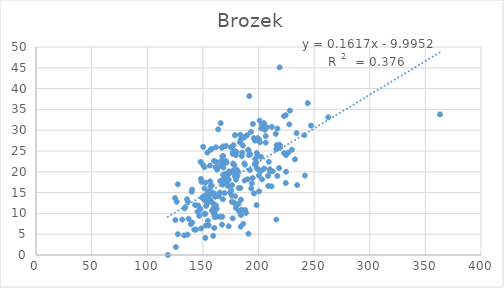
| Category | Brozek |
|---|---|
| 154.25 | 12.6 |
| 173.25 | 6.9 |
| 154.0 | 24.6 |
| 184.75 | 10.9 |
| 184.25 | 27.8 |
| 210.25 | 20.6 |
| 181.0 | 19 |
| 176.0 | 12.8 |
| 191.0 | 5.1 |
| 198.25 | 12 |
| 186.25 | 7.5 |
| 216.0 | 8.5 |
| 180.5 | 20.5 |
| 205.25 | 20.8 |
| 187.75 | 21.7 |
| 162.75 | 20.5 |
| 195.75 | 28.1 |
| 209.25 | 22.4 |
| 183.75 | 16.1 |
| 211.75 | 16.5 |
| 179.0 | 19 |
| 200.5 | 15.3 |
| 140.25 | 15.7 |
| 148.75 | 17.6 |
| 151.25 | 14.2 |
| 159.25 | 4.6 |
| 131.5 | 8.5 |
| 148.0 | 22.4 |
| 133.25 | 4.7 |
| 160.75 | 9.4 |
| 182.0 | 12.3 |
| 160.25 | 6.5 |
| 168.0 | 13.4 |
| 218.5 | 20.9 |
| 247.25 | 31.1 |
| 191.75 | 38.2 |
| 202.25 | 23.6 |
| 196.75 | 27.5 |
| 363.15 | 33.8 |
| 203.0 | 31.3 |
| 262.75 | 33.1 |
| 205.0 | 31.7 |
| 217.0 | 30.4 |
| 212.0 | 30.8 |
| 125.25 | 8.4 |
| 164.25 | 14.1 |
| 133.5 | 11.2 |
| 148.5 | 6.4 |
| 135.75 | 13.4 |
| 127.5 | 5 |
| 158.25 | 10.7 |
| 139.25 | 7.4 |
| 137.25 | 8.7 |
| 152.75 | 7.1 |
| 136.25 | 4.9 |
| 198.0 | 22.2 |
| 181.5 | 20.1 |
| 201.25 | 27.1 |
| 202.5 | 30.4 |
| 179.75 | 24 |
| 216.0 | 25.4 |
| 178.75 | 28.8 |
| 193.25 | 29.6 |
| 178.0 | 25.1 |
| 205.5 | 31 |
| 183.5 | 28.9 |
| 151.5 | 21.1 |
| 154.75 | 14 |
| 155.25 | 7.1 |
| 156.75 | 13.2 |
| 167.5 | 23.7 |
| 146.75 | 9.4 |
| 160.75 | 9.1 |
| 125.0 | 13.7 |
| 143.0 | 12 |
| 148.25 | 18.3 |
| 162.5 | 9.2 |
| 177.75 | 21.7 |
| 161.25 | 21.1 |
| 171.25 | 18.6 |
| 163.75 | 30.2 |
| 150.25 | 26 |
| 190.25 | 18.2 |
| 170.75 | 26.2 |
| 168.0 | 26.1 |
| 167.0 | 25.8 |
| 157.75 | 15 |
| 160.0 | 22.6 |
| 176.75 | 8.8 |
| 176.0 | 14.3 |
| 177.0 | 20.2 |
| 179.75 | 18.1 |
| 165.25 | 9.2 |
| 192.5 | 24.2 |
| 184.25 | 9.6 |
| 224.5 | 17.3 |
| 188.75 | 10.1 |
| 162.5 | 11.1 |
| 156.5 | 17.7 |
| 197.0 | 21.7 |
| 198.5 | 20.8 |
| 173.75 | 20.1 |
| 172.75 | 19.8 |
| 196.75 | 21.9 |
| 177.0 | 24.7 |
| 165.5 | 17.8 |
| 200.25 | 19.1 |
| 203.25 | 18.2 |
| 194.0 | 17.2 |
| 168.5 | 21 |
| 170.75 | 19.5 |
| 183.25 | 27.1 |
| 178.25 | 21.6 |
| 163.0 | 20.9 |
| 175.25 | 25.9 |
| 158.0 | 16.7 |
| 177.25 | 19.8 |
| 179.0 | 14.1 |
| 191.0 | 25.1 |
| 187.5 | 17.9 |
| 206.5 | 27 |
| 185.25 | 24.6 |
| 160.25 | 14.8 |
| 151.5 | 16 |
| 161.0 | 14 |
| 167.0 | 17.4 |
| 177.5 | 26.4 |
| 152.25 | 17.4 |
| 192.25 | 20.4 |
| 165.25 | 15 |
| 171.75 | 18 |
| 171.25 | 22.2 |
| 197.0 | 23.1 |
| 157.0 | 25.3 |
| 168.25 | 23.8 |
| 186.0 | 26.3 |
| 166.75 | 21.4 |
| 187.75 | 28.4 |
| 168.25 | 21.8 |
| 212.75 | 20.1 |
| 176.75 | 24.3 |
| 173.25 | 18.1 |
| 167.0 | 22.7 |
| 159.75 | 9.9 |
| 188.15 | 10.8 |
| 156.0 | 14.4 |
| 208.5 | 19 |
| 206.5 | 28.6 |
| 143.75 | 6.1 |
| 223.0 | 24.5 |
| 152.25 | 9.9 |
| 241.75 | 19.1 |
| 146.0 | 10.6 |
| 156.75 | 16.5 |
| 200.25 | 20.5 |
| 171.5 | 17.2 |
| 205.75 | 30.1 |
| 182.5 | 10.5 |
| 136.5 | 12.8 |
| 177.25 | 22 |
| 151.25 | 9.9 |
| 196.0 | 14.8 |
| 184.25 | 13.3 |
| 140.0 | 15.2 |
| 218.75 | 26.5 |
| 217.0 | 19 |
| 166.25 | 21.4 |
| 224.75 | 20 |
| 228.25 | 34.7 |
| 172.75 | 16.5 |
| 152.25 | 4.1 |
| 125.75 | 1.9 |
| 177.25 | 20.2 |
| 176.25 | 16.8 |
| 226.75 | 24.6 |
| 145.25 | 10.4 |
| 151.0 | 13.4 |
| 241.25 | 28.8 |
| 187.25 | 22 |
| 234.75 | 16.8 |
| 219.25 | 25.8 |
| 118.5 | 0 |
| 145.75 | 11.9 |
| 159.25 | 12.4 |
| 170.5 | 17.4 |
| 167.5 | 9.2 |
| 232.75 | 23 |
| 210.5 | 20.1 |
| 202.25 | 20.2 |
| 185.0 | 23.8 |
| 153.0 | 11.8 |
| 244.25 | 36.5 |
| 193.5 | 16 |
| 224.75 | 24 |
| 162.75 | 22.3 |
| 180.0 | 24.8 |
| 156.25 | 21.5 |
| 168.0 | 17.6 |
| 167.25 | 7.3 |
| 170.75 | 22.6 |
| 178.25 | 12.5 |
| 150.0 | 21.7 |
| 200.5 | 27.7 |
| 184.0 | 6.8 |
| 223.0 | 33.4 |
| 208.75 | 16.6 |
| 166.0 | 31.7 |
| 195.0 | 31.5 |
| 160.5 | 10.1 |
| 159.75 | 11.3 |
| 140.5 | 7.8 |
| 216.25 | 26.4 |
| 168.25 | 19.3 |
| 194.75 | 18.5 |
| 172.75 | 19.3 |
| 219.0 | 45.1 |
| 149.25 | 13.8 |
| 154.5 | 8.2 |
| 199.25 | 23.9 |
| 154.5 | 15.1 |
| 153.25 | 12.7 |
| 230.0 | 25.3 |
| 161.75 | 11.9 |
| 142.25 | 6.1 |
| 179.75 | 11.3 |
| 126.5 | 12.8 |
| 169.5 | 14.9 |
| 198.5 | 24.5 |
| 174.5 | 15 |
| 167.75 | 16.9 |
| 147.75 | 11.1 |
| 182.25 | 16.1 |
| 175.5 | 15.5 |
| 161.75 | 25.9 |
| 157.75 | 25.5 |
| 168.75 | 18.4 |
| 191.5 | 24 |
| 219.15 | 26.4 |
| 155.25 | 12.7 |
| 189.75 | 28.8 |
| 127.5 | 17 |
| 224.5 | 33.6 |
| 234.25 | 29.3 |
| 227.75 | 31.4 |
| 199.5 | 28.1 |
| 155.5 | 15.3 |
| 215.5 | 29.1 |
| 134.25 | 11.5 |
| 201.0 | 32.3 |
| 186.75 | 28.3 |
| 190.75 | 25.3 |
| 207.5 | 30.7 |